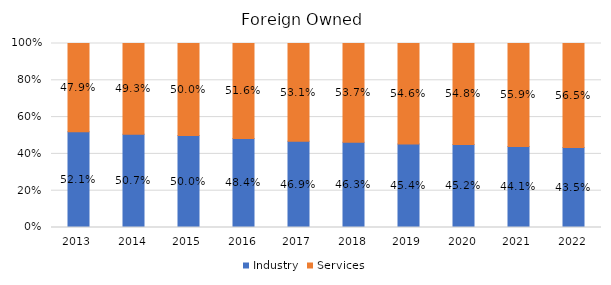
| Category | Industry | Services |
|---|---|---|
| 2013.0 | 0.521 | 0.479 |
| 2014.0 | 0.507 | 0.493 |
| 2015.0 | 0.5 | 0.5 |
| 2016.0 | 0.484 | 0.516 |
| 2017.0 | 0.469 | 0.531 |
| 2018.0 | 0.463 | 0.537 |
| 2019.0 | 0.454 | 0.546 |
| 2020.0 | 0.452 | 0.548 |
| 2021.0 | 0.441 | 0.559 |
| 2022.0 | 0.435 | 0.565 |